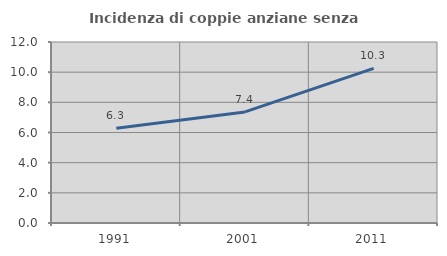
| Category | Incidenza di coppie anziane senza figli  |
|---|---|
| 1991.0 | 6.281 |
| 2001.0 | 7.363 |
| 2011.0 | 10.252 |